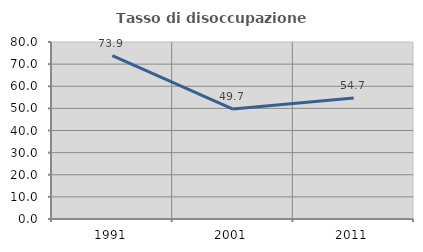
| Category | Tasso di disoccupazione giovanile  |
|---|---|
| 1991.0 | 73.862 |
| 2001.0 | 49.708 |
| 2011.0 | 54.676 |